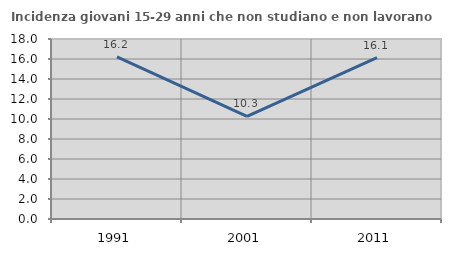
| Category | Incidenza giovani 15-29 anni che non studiano e non lavorano  |
|---|---|
| 1991.0 | 16.216 |
| 2001.0 | 10.271 |
| 2011.0 | 16.143 |